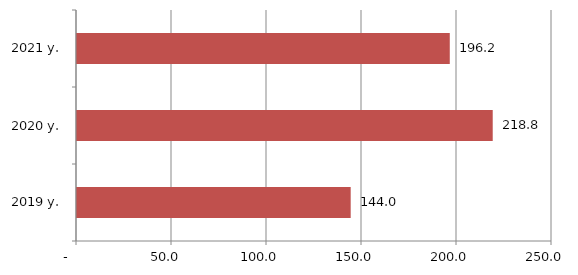
| Category | Series 0 |
|---|---|
| 2019 y. | 144.047 |
| 2020 y. | 218.8 |
| 2021 y. | 196.2 |